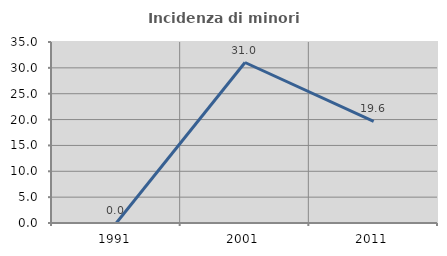
| Category | Incidenza di minori stranieri |
|---|---|
| 1991.0 | 0 |
| 2001.0 | 31.034 |
| 2011.0 | 19.643 |